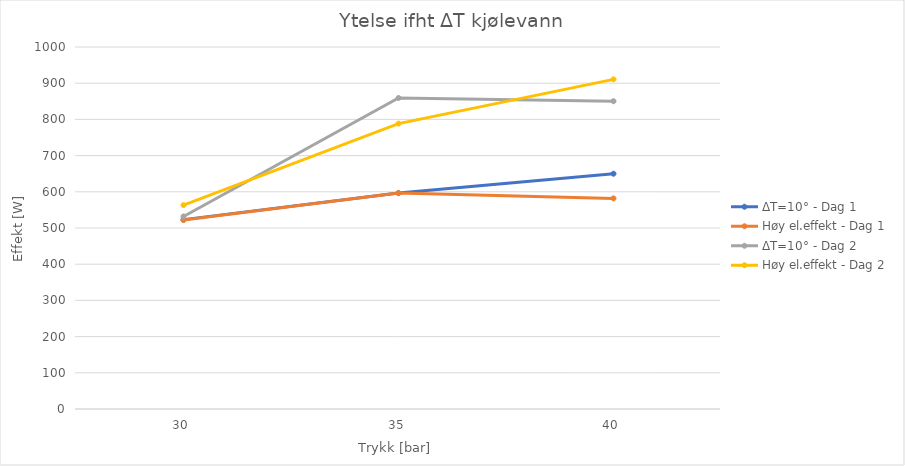
| Category | ΔT=10° - Dag 1 | Høy el.effekt - Dag 1 | ΔT=10° - Dag 2 | Høy el.effekt - Dag 2 |
|---|---|---|---|---|
| 30.0 | 523.117 | 522.072 | 531.919 | 563.205 |
| 35.0 | 596.434 | 596.434 | 859.181 | 788.38 |
| 40.0 | 649.934 | 581.801 | 850.236 | 910.644 |